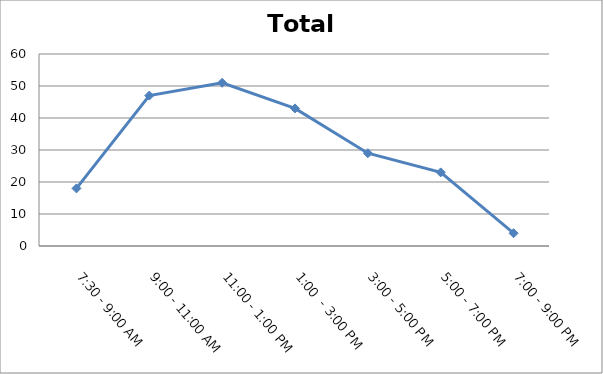
| Category | Total |
|---|---|
| 7:30 - 9:00 AM | 18 |
| 9:00 - 11:00 AM | 47 |
| 11:00 - 1:00 PM | 51 |
| 1:00  - 3:00 PM | 43 |
| 3:00 - 5:00 PM | 29 |
| 5:00 - 7:00 PM | 23 |
| 7:00 - 9:00 PM | 4 |